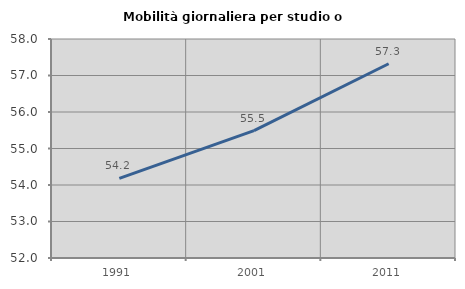
| Category | Mobilità giornaliera per studio o lavoro |
|---|---|
| 1991.0 | 54.182 |
| 2001.0 | 55.49 |
| 2011.0 | 57.322 |